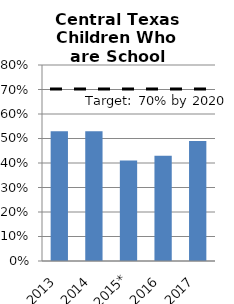
| Category | % of Central Texas Children who Enter Kindergarten School Ready |
|---|---|
| 2013 | 0.53 |
| 2014 | 0.53 |
| 2015* | 0.41 |
| 2016 | 0.43 |
| 2017 | 0.49 |